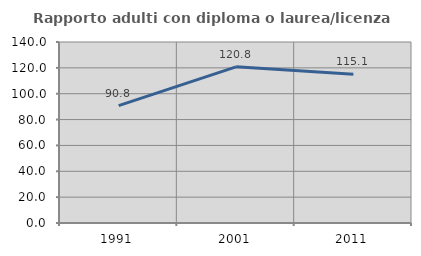
| Category | Rapporto adulti con diploma o laurea/licenza media  |
|---|---|
| 1991.0 | 90.805 |
| 2001.0 | 120.792 |
| 2011.0 | 115.079 |